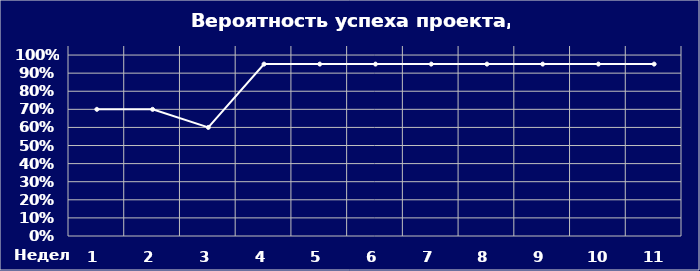
| Category | Вероятность успеха проекта, % |
|---|---|
| 0 | 0.7 |
| 1 | 0.7 |
| 2 | 0.6 |
| 3 | 0.95 |
| 4 | 0.95 |
| 5 | 0.95 |
| 6 | 0.95 |
| 7 | 0.95 |
| 8 | 0.95 |
| 9 | 0.95 |
| 10 | 0.95 |